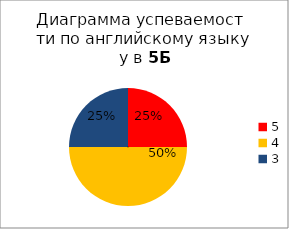
| Category | Series 0 | 5 4 3 2 |
|---|---|---|
| 5.0 | 2 |  |
| 4.0 | 4 |  |
| 3.0 | 2 |  |